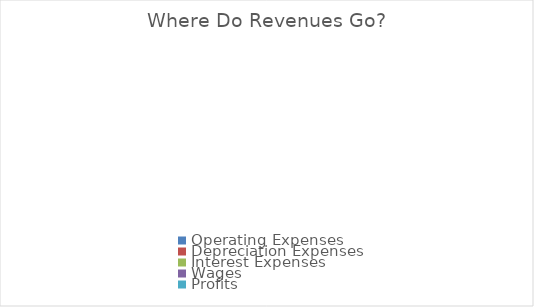
| Category | Operating Expenses |
|---|---|
| Operating Expenses | 0 |
| Depreciation Expenses | 0 |
| Interest Expenses | 0 |
| Wages | 0 |
| Profits | 0 |